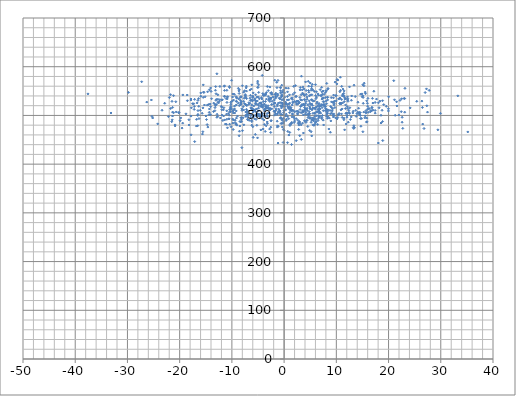
| Category | Series 0 |
|---|---|
| 4.020889663652958 | 487.889 |
| 8.666376458706178 | 494.467 |
| -11.400367761558238 | 539.503 |
| 10.10543404432976 | 564.704 |
| 17.017845351756538 | 510.826 |
| 12.024200785188862 | 496.414 |
| 3.7679746479980896 | 543.188 |
| 13.6166224882079 | 538.771 |
| -7.849052797542254 | 495.155 |
| -16.65649057304688 | 525.623 |
| 4.977959538762961 | 515.277 |
| -14.30051012747557 | 552.571 |
| 26.485316143453833 | 516.425 |
| 9.306132584934135 | 513.712 |
| -9.814722098075785 | 484.224 |
| 2.2791367858373923 | 527.232 |
| -4.667478627555358 | 497.495 |
| 1.972812229281491 | 492.958 |
| 5.702309534434009 | 479.553 |
| -14.06736728329123 | 556.431 |
| 15.539054268911121 | 547.941 |
| 12.882956033211942 | 531.123 |
| -21.469662265395165 | 528.885 |
| 3.291968419121732 | 450.742 |
| -10.209891859033354 | 527.165 |
| -0.6901475152669783 | 519.903 |
| 10.678569320304277 | 548.677 |
| 0.03272742100057964 | 524.516 |
| 8.118310964629085 | 511.563 |
| -0.572068605589451 | 483.486 |
| -11.955807737046143 | 532.019 |
| -4.891582692533757 | 509.408 |
| 3.5328235944934163 | 484.14 |
| 1.1275742094991523 | 481.486 |
| -3.978518819819341 | 528.704 |
| 7.620559774247827 | 520.125 |
| -15.959182661390686 | 546.136 |
| 8.107132174482942 | 550.406 |
| 7.463517362909684 | 550.031 |
| 11.526156246430826 | 528.451 |
| 2.616841155198111 | 529.19 |
| -11.243794592288227 | 482.274 |
| 10.923757760540845 | 523.85 |
| -0.5506642741785494 | 502.108 |
| -11.123671592526163 | 534.777 |
| 22.194955545716013 | 530.988 |
| 5.324095842789516 | 491.753 |
| -6.858480423349419 | 501.786 |
| 19.973253941958355 | 513.623 |
| 3.799321217318141 | 554.472 |
| 5.526508695540478 | 529.255 |
| -25.168814595845866 | 494.727 |
| -9.811035502513509 | 543.996 |
| 7.320830920961375 | 543.422 |
| -4.986446564477005 | 522.674 |
| -1.5756684171854636 | 545.613 |
| -0.8335834247544284 | 505.599 |
| -27.277728749049313 | 569.106 |
| -1.875530647269871 | 531.664 |
| 3.4240633430080365 | 505.965 |
| -7.2689956721881614 | 556.523 |
| -3.387179413627966 | 533.546 |
| 7.240800233243361 | 521.758 |
| -5.021316943802068 | 557.924 |
| -33.150983786689 | 505.009 |
| 10.695639347004956 | 535.718 |
| 9.104212406747815 | 504.783 |
| -18.219286031188865 | 491.137 |
| 11.2673836542509 | 554.069 |
| 20.998615892734758 | 571.234 |
| 22.976995447488626 | 534.796 |
| -6.437276833090726 | 541.323 |
| 6.904272975298067 | 552.968 |
| -12.968195725528197 | 522.207 |
| -8.090534507597123 | 433.855 |
| -3.6248518741455653 | 513.777 |
| 0.1906151296513444 | 518.179 |
| -4.412086276968699 | 518.717 |
| 6.215142262199225 | 537.681 |
| -6.689542375990567 | 489.851 |
| -5.54384850577268 | 500.193 |
| 12.232496162468308 | 529.1 |
| -7.562294072355809 | 550.765 |
| -5.369750026801126 | 491.786 |
| 5.050934207193368 | 542.195 |
| 11.738430657252781 | 514.166 |
| 6.883112295215685 | 497.959 |
| 8.051765675242114 | 529.495 |
| -7.411970291996958 | 522.685 |
| -5.017921443724143 | 557.373 |
| 16.915826145424326 | 534.98 |
| -13.11948904171033 | 520.142 |
| -7.204188643154745 | 549.891 |
| -8.607147365773487 | 545.118 |
| 22.59481806907088 | 486.074 |
| -10.289261413181718 | 515.899 |
| 3.256854055339437 | 480.704 |
| 22.43280632856385 | 507.683 |
| -4.495425267662369 | 525.846 |
| -16.303828797695996 | 493.549 |
| -13.514520739736662 | 507.796 |
| -4.870710572459214 | 547.259 |
| -9.388312029363453 | 485.266 |
| -0.5534771542657639 | 526.042 |
| -7.343947494626702 | 499.085 |
| 3.3980811831222955 | 522.202 |
| 14.840867685781351 | 493.855 |
| -4.533029480275617 | 499.835 |
| -10.51027545952997 | 500.493 |
| -17.30601176615438 | 523.957 |
| -15.250297876450546 | 521.357 |
| 8.412617928507181 | 555.418 |
| 6.908030778679185 | 513.342 |
| 8.862876182075453 | 465.498 |
| 2.265802254576871 | 538.599 |
| -6.535030759373179 | 524.692 |
| 3.6079663396570503 | 558.547 |
| -7.335130754379181 | 507.018 |
| -8.302347213213402 | 537.293 |
| 11.771656671646005 | 521.557 |
| 6.453294856926684 | 512.111 |
| -12.863187392488449 | 585.501 |
| 9.019904037735984 | 536.65 |
| -2.5918385348324855 | 532.995 |
| -0.7821998156380922 | 526.377 |
| -4.079847795319084 | 544.827 |
| 5.540758082312374 | 515.341 |
| -9.054084694791227 | 536.624 |
| 8.865596437877086 | 503.396 |
| -2.771536827236209 | 472.014 |
| 3.4861567451997475 | 552.426 |
| -2.8886126965909704 | 533.641 |
| 6.33122879422555 | 527.652 |
| 7.4011976993006545 | 536.213 |
| -12.671520920202791 | 526.973 |
| 3.008986405605033 | 484.298 |
| 2.9954019070568556 | 458.322 |
| -3.721176898185336 | 508.973 |
| -0.4527448093347102 | 562.011 |
| -4.631427362829501 | 498.902 |
| 9.477008196627233 | 541.793 |
| 12.388533978391964 | 510.437 |
| -0.2642339316140674 | 548.254 |
| -1.7660598708444504 | 507.236 |
| -11.539534516509477 | 515.868 |
| -0.9229786377349976 | 535.562 |
| 15.256986748873247 | 506.833 |
| 10.657074448385298 | 524.319 |
| -1.2944621170838697 | 522.368 |
| -11.828244427921073 | 531.999 |
| 4.562705566871302 | 521.909 |
| 4.831423844168306 | 507.692 |
| 18.75745794546754 | 510.594 |
| -2.2991716892343286 | 529.01 |
| 7.898861567104782 | 536.611 |
| -6.2183763300460155 | 490.014 |
| -8.17876645336175 | 492.156 |
| -7.226172151266567 | 501.332 |
| 2.4601521618704654 | 522.584 |
| 8.94742797030709 | 488.719 |
| -6.1500319676210715 | 513.542 |
| 4.748679404653309 | 498.208 |
| -3.8769093527866954 | 540.759 |
| 11.261910105101496 | 541.552 |
| 6.604071535089689 | 541.622 |
| 15.587928807677107 | 544.629 |
| 3.866141711113143 | 532.723 |
| -0.11612103247951988 | 533.567 |
| -11.035552929769077 | 481.819 |
| 4.730125321286541 | 547.699 |
| -15.495459150222555 | 537.089 |
| 11.212482580054957 | 525.751 |
| 9.719339671237936 | 516.104 |
| 15.681934678567755 | 509.802 |
| -0.12194209419863605 | 531.109 |
| -6.176028438756518 | 531.237 |
| 8.156983124523457 | 505.406 |
| 9.56608912662563 | 524.382 |
| -11.623824665013228 | 511.485 |
| -4.357491706021117 | 536.651 |
| 16.112590596052943 | 514.2 |
| 6.394821238095201 | 506.83 |
| -4.177847068823884 | 582.151 |
| -3.675385649219151 | 497.798 |
| -3.4611014508136915 | 520.535 |
| -9.161469069056281 | 521.493 |
| -17.833178258344365 | 531.713 |
| 1.6662782958403433 | 525.948 |
| 21.14016902829146 | 532.122 |
| 3.601647227532601 | 506.907 |
| -11.407211121839005 | 551.407 |
| 14.9048232541103 | 544.198 |
| 1.26909503791304 | 515.409 |
| -10.432216282862607 | 481.965 |
| -15.639216001202191 | 461.741 |
| 4.998032224693207 | 566.624 |
| 7.891825113254695 | 547.006 |
| 15.46726953179002 | 495.116 |
| 8.36911457673294 | 554.336 |
| -2.7341910452540525 | 528.731 |
| -8.944732433671254 | 498.578 |
| 2.294563684311624 | 539.229 |
| 15.996016611821835 | 518.915 |
| 3.532314995367608 | 545.814 |
| 3.922913444527613 | 516.387 |
| -9.504097154117861 | 513.308 |
| -8.349002199040065 | 537.673 |
| 26.789533576503466 | 473.155 |
| -5.522277980301064 | 530.37 |
| 1.5343684459499374 | 509.961 |
| 6.662172457174716 | 522.363 |
| 5.886855208660111 | 505.198 |
| 4.912371829544569 | 494.15 |
| 15.15191717654285 | 524.908 |
| 5.536488083639955 | 494.92 |
| 9.22585353122807 | 509.318 |
| -2.31018048208808 | 543.458 |
| -8.053843163305988 | 510.396 |
| 9.635246173422262 | 529.359 |
| -3.0807667281212683 | 519.898 |
| -4.014286364591656 | 472.155 |
| -3.767992463028876 | 523.127 |
| -21.747719590051954 | 542.669 |
| -21.170049775620658 | 540.613 |
| -29.792166187702552 | 547.216 |
| 3.677324332029213 | 523.023 |
| -3.2091828828661724 | 483.268 |
| 13.22249328497958 | 508.581 |
| -7.22776952681058 | 560.126 |
| -1.9574790375859892 | 508.729 |
| 1.5410596853289968 | 511.026 |
| -1.2612756237071636 | 540.652 |
| 3.6527147346736846 | 522.155 |
| 11.884493084806618 | 482.468 |
| -5.991312759671497 | 539.595 |
| 6.726843970627275 | 518.429 |
| 3.563253358682552 | 509.785 |
| 14.711855222214117 | 477.864 |
| 6.178728895452695 | 517.147 |
| -12.4164114476203 | 529.127 |
| -8.19884172609439 | 528.036 |
| 5.504764853663712 | 552.071 |
| -13.886531059225694 | 534.305 |
| 3.0525128501819347 | 512.245 |
| 7.190598961647408 | 557.669 |
| 22.7243444899745 | 473.495 |
| 3.1594499847658786 | 518.298 |
| 7.237942664584674 | 548.552 |
| 6.48690610889485 | 489.374 |
| -15.13006567875323 | 538.29 |
| 15.673836223146338 | 505.467 |
| 3.382592669866783 | 531.402 |
| 11.587738651299308 | 470.405 |
| 16.301586772816083 | 514.113 |
| -7.346000797646131 | 537.274 |
| 2.0352927211345153 | 528.726 |
| 3.9859563325237213 | 512.064 |
| 3.0297209828529 | 536.874 |
| 24.13947817652968 | 515.404 |
| -15.547208008286804 | 515.444 |
| 5.322235568195272 | 523.277 |
| 16.773700380185215 | 509.584 |
| -17.832437223969507 | 498.653 |
| 4.405056956435478 | 514.666 |
| 6.628347364245019 | 499.41 |
| -11.416678870618636 | 560.851 |
| -5.072103014475499 | 566.389 |
| -17.138065980567305 | 532.996 |
| -21.177228231403753 | 505.498 |
| 5.525475045700292 | 504.252 |
| 0.4083818048347049 | 502.53 |
| 14.095654946466668 | 506.836 |
| 5.840438744665292 | 480.716 |
| -10.203375108717639 | 523.052 |
| -3.6997910050691725 | 499.298 |
| -9.03368654183378 | 535.173 |
| -18.191868692671193 | 480.351 |
| -0.3473666563452558 | 525.499 |
| -7.172442270153729 | 508.461 |
| -1.3579150360048953 | 501.856 |
| 10.748639041550023 | 523.428 |
| 5.099636988114229 | 522.583 |
| -4.858493562522153 | 520.206 |
| 8.973290730328511 | 510.14 |
| 0.8167764318272951 | 555.976 |
| 13.471051881277681 | 475.267 |
| 6.421232325660244 | 519.26 |
| 12.522250009028054 | 558.628 |
| -10.193129030680819 | 518.613 |
| -6.1839463613157415 | 521.226 |
| -3.974231798029071 | 541.512 |
| 3.1753391555867 | 532.267 |
| -1.5393551295178283 | 513.857 |
| -21.35120943886388 | 506.753 |
| 13.166630707599818 | 505.122 |
| -13.23269877102308 | 516.104 |
| 25.402123454529168 | 529.022 |
| -20.87095749208612 | 478.428 |
| -4.812153641499824 | 499.207 |
| -4.791822234159259 | 502.454 |
| 2.580550172987566 | 503.789 |
| 1.9143216239137022 | 485.464 |
| 7.026491717702048 | 519.537 |
| 11.128366049081729 | 495.95 |
| 2.314359638632393 | 448.209 |
| 11.586899685479548 | 537.302 |
| 10.276425581601266 | 495.857 |
| 14.612124839427448 | 493.654 |
| -2.6545596418085897 | 514.286 |
| -5.443832715676571 | 525.408 |
| 8.587979571039511 | 510.498 |
| -5.8775620843742535 | 512.037 |
| 11.448413821122069 | 491.122 |
| 27.26229719149421 | 554.529 |
| 2.378493205683833 | 523.63 |
| 0.3315036471040014 | 523.267 |
| -9.170183791987512 | 529.085 |
| -25.302903702157533 | 498.113 |
| 17.42345668448073 | 526.702 |
| -11.469082202929743 | 559.762 |
| 4.7222963927221935 | 502.078 |
| 1.7189803676005928 | 528.029 |
| -2.7071687997272753 | 535.584 |
| 7.872484515232859 | 509.921 |
| 5.152355206702785 | 551.708 |
| -13.984603853385396 | 549.378 |
| -6.431083210379031 | 495.855 |
| 18.548890911260823 | 484.401 |
| -8.14521385549659 | 487.771 |
| -20.133117398446394 | 506.243 |
| -1.0693498796865948 | 525.563 |
| -12.295484712744054 | 532.365 |
| 10.43826164102534 | 533.85 |
| -16.49720951621134 | 502.087 |
| 7.625913993255683 | 522.46 |
| 11.894636391448632 | 504.707 |
| 4.9046568461575095 | 469.105 |
| 13.248727716470288 | 475.339 |
| -7.411257688362127 | 539.634 |
| -3.642948246665068 | 543.095 |
| 2.935683636814889 | 487.405 |
| 20.017042304917943 | 538.178 |
| -5.473640717293494 | 524.008 |
| 8.074912735472724 | 510.656 |
| 4.308576103031537 | 490.064 |
| 4.708356439643459 | 560.052 |
| -5.537087298549887 | 511.893 |
| -6.247254457562489 | 514.82 |
| 4.4622116755387875 | 510.246 |
| 8.148755141288174 | 502.744 |
| 15.785788290117637 | 486.239 |
| -2.4168316441225968 | 546.889 |
| -11.437093591698531 | 539.057 |
| -3.3424465233690333 | 517.104 |
| 9.545383892767656 | 521.668 |
| 7.352402043301624 | 499.877 |
| 4.828759756218786 | 502.926 |
| 6.091329473862353 | 491.881 |
| 5.652236538582406 | 488.841 |
| -17.54531920625098 | 524.131 |
| 7.921984602981025 | 518.474 |
| 16.103953777190114 | 506.424 |
| -15.370620142310907 | 546.994 |
| -10.446983937720864 | 557.181 |
| -8.576782168502753 | 552.595 |
| 11.108344059945795 | 513.31 |
| -7.99321063535246 | 560.967 |
| 0.4384817630488301 | 492.043 |
| -3.869971552308785 | 490.575 |
| -9.80841436523312 | 509.044 |
| 7.480140192245939 | 490.351 |
| 6.690693150054637 | 524.633 |
| -15.47609990959345 | 562.66 |
| 10.853801044571282 | 525.421 |
| -3.3071573403470977 | 514.304 |
| -11.743580620452962 | 489.621 |
| 6.42461064676102 | 481.525 |
| -21.427809487672874 | 490.962 |
| -20.180276397107015 | 505.353 |
| 27.01369935408559 | 546.925 |
| -17.22264488707575 | 512.469 |
| 11.443226354413099 | 540.182 |
| -1.118296878246059 | 507.166 |
| -9.709481364484924 | 490.649 |
| 5.111974884831262 | 495.319 |
| -2.3700119832116693 | 543.75 |
| 17.18792638456908 | 549.694 |
| -1.874746132503879 | 518.301 |
| -8.310149120890616 | 486.863 |
| -9.45933317139092 | 504.992 |
| -6.102368486131119 | 512.759 |
| 8.302824142769811 | 537.74 |
| 18.848451008243153 | 487.45 |
| -11.909071769863138 | 500.681 |
| 5.31275960534962 | 542.378 |
| 9.37422676171384 | 526.886 |
| -6.30830994615856 | 531.374 |
| 4.102436837867216 | 524.731 |
| -2.8227626129233943 | 514.147 |
| 0.9702953502779554 | 518.094 |
| 3.2654235568020407 | 542.515 |
| 0.9063730655646528 | 514.288 |
| -4.257010690083628 | 533.818 |
| 8.077360188772497 | 509.377 |
| -17.203587692213745 | 518.35 |
| -8.324306867336476 | 525.812 |
| 2.7210639509115446 | 524.375 |
| 9.956437366911324 | 541.096 |
| -17.82020618787468 | 460.157 |
| -18.797713823003583 | 503.249 |
| -18.512644806266064 | 530.182 |
| 4.105319570099351 | 568.784 |
| 26.541010633620537 | 482.245 |
| 3.783884532118521 | 521.752 |
| -0.13604454473010485 | 493.897 |
| 29.44929156340108 | 470.439 |
| -9.846774537727434 | 492.514 |
| 0.2480072175359735 | 527.474 |
| -5.761758748034638 | 511.025 |
| 4.537034491521446 | 477.394 |
| 4.242452236158169 | 543.375 |
| 11.030530244709055 | 559.659 |
| -9.223574017437212 | 538.514 |
| -0.10486147346082603 | 505.931 |
| -10.48336773062374 | 559.571 |
| -1.2752808803190203 | 478.603 |
| -21.725982194978343 | 514.213 |
| -5.918152474961466 | 454.93 |
| -3.050247468917641 | 538.698 |
| 8.292434834967478 | 511.539 |
| 0.2944107458686491 | 512.234 |
| 5.269362457527384 | 531.969 |
| -1.4091774831485862 | 568.088 |
| -5.953433308258757 | 506.922 |
| 0.10599963726106948 | 537.509 |
| -14.340685886636946 | 506.372 |
| -0.3650521946907063 | 490.15 |
| -2.879377150570108 | 533.601 |
| -11.941732311762005 | 511.594 |
| -6.188929351264185 | 487.323 |
| 6.934080717091058 | 519.364 |
| -5.666189919465707 | 493.167 |
| -6.186077774851922 | 479.997 |
| 1.585401060849973 | 503.506 |
| -9.73364536120543 | 505.067 |
| 5.180977163226031 | 466.542 |
| 1.346745252966687 | 509.562 |
| 0.8905686501307758 | 523.353 |
| -8.613902428699015 | 458.231 |
| -16.361280891747988 | 534.655 |
| -12.290319776365347 | 559.518 |
| -21.367036366437052 | 498.755 |
| 12.858603070205112 | 496.901 |
| 3.958108118163621 | 520.671 |
| -11.033496832100855 | 502.523 |
| 0.6121140786095336 | 522.024 |
| 9.453250935023348 | 527.423 |
| -17.83417819554732 | 533.714 |
| 1.2930807926330354 | 516.197 |
| -4.750338519460241 | 534.153 |
| -9.127579874779894 | 494.582 |
| -1.6215894340838208 | 539.059 |
| -2.495642938280925 | 489.453 |
| 1.6246878742357154 | 502.24 |
| 3.054579876867479 | 552.403 |
| -14.647149624870762 | 548.486 |
| -9.687096849320218 | 531.6 |
| 16.05010855852264 | 535.067 |
| -0.3382400303715375 | 518.667 |
| -4.256679425265922 | 503.98 |
| -20.655949982774928 | 507.159 |
| -8.259674211107786 | 538.678 |
| -1.7689973076697663 | 572.184 |
| -7.151391854199364 | 520.195 |
| -0.6362210882771837 | 495.084 |
| -2.728370801442637 | 558.232 |
| -6.963113604947952 | 491.185 |
| 7.250061105238178 | 533.609 |
| -8.476400511836422 | 478.275 |
| 33.26945893613906 | 540.175 |
| -6.533739300597593 | 535.348 |
| -14.072095924104183 | 518.023 |
| -4.710442376874059 | 525.039 |
| 6.784343958041836 | 508.191 |
| 15.556431174684667 | 499.084 |
| -0.6234696943460811 | 495.546 |
| 5.953714219481546 | 513.311 |
| -1.2238555189393547 | 503.906 |
| -0.6967672838892256 | 550.805 |
| -6.32214343975231 | 515.962 |
| 17.69340396142605 | 533.567 |
| -6.019222268800444 | 536.885 |
| -7.755245486815628 | 547.803 |
| -14.149539102620635 | 523.451 |
| 0.6581072493272837 | 548.435 |
| -1.323339076512532 | 488.178 |
| -0.22138708228966553 | 518.841 |
| -7.05473676750502 | 505.228 |
| -14.507622103194544 | 522.271 |
| -4.889188498898087 | 562.769 |
| 5.251805670783067 | 559.591 |
| 9.33450010872184 | 501.399 |
| 4.627412064042677 | 570.01 |
| -1.128867525908814 | 477.867 |
| 0.43126924554415647 | 524.744 |
| -24.203067260715265 | 482.679 |
| 5.767467292624465 | 493.297 |
| -20.742374668966438 | 528.124 |
| -0.7603687112696139 | 508.98 |
| 3.7017013214887937 | 463.931 |
| 5.337241691348099 | 490.137 |
| -22.867918141000747 | 525.024 |
| -6.102516412615222 | 530.569 |
| -14.29478780713743 | 513.197 |
| -16.056998856897952 | 510.502 |
| -15.693352862221044 | 504.393 |
| -0.44172527040828713 | 532.324 |
| 8.244135492924357 | 493.992 |
| 18.551838678884476 | 500.281 |
| -5.95818184099786 | 497.31 |
| -1.8475692372826624 | 500.539 |
| 26.385062482495186 | 529.414 |
| 6.658096238182488 | 496.629 |
| -9.050965031461548 | 480.044 |
| 0.27887282062855706 | 498.603 |
| 3.900410666202293 | 540.668 |
| -19.909432457542 | 489.165 |
| 1.724223087621332 | 510.208 |
| 8.382781024144 | 497.153 |
| 12.219360840930726 | 534.081 |
| -9.167520041561497 | 509.162 |
| -5.5141922567837796 | 461.048 |
| -0.37755112032424215 | 539.912 |
| -5.995304761575391 | 476.765 |
| 8.301769905127202 | 536.688 |
| 18.067668429475848 | 525.95 |
| -4.144436690352646 | 503.843 |
| -0.16013144081507652 | 552.021 |
| 9.771693574605035 | 568.427 |
| 8.916877078221122 | 518.278 |
| 15.843960997354436 | 494.48 |
| -7.061694382826353 | 501.708 |
| 21.97560301685554 | 500.794 |
| 7.930149818531027 | 514.398 |
| -0.6439440365568285 | 501.732 |
| -5.226381877920472 | 498.162 |
| -0.4568351160825379 | 540.767 |
| -14.70597654826075 | 521.074 |
| 5.744592656690811 | 530.025 |
| 1.0638546872784183 | 525.242 |
| -6.739550272089537 | 526.051 |
| -19.535353101396655 | 474.01 |
| -6.958263498586246 | 497.275 |
| 4.06472470363797 | 502.553 |
| 16.998945938680254 | 525.469 |
| 12.938311229731067 | 539.956 |
| 12.121919026388293 | 504.913 |
| 0.004800069609173341 | 469.613 |
| -0.4241542228069659 | 483.69 |
| 2.597163799700031 | 509.026 |
| 12.286337654557386 | 486.188 |
| -4.450807528215792 | 470.275 |
| 3.2305947378871824 | 505.965 |
| -4.362897485309376 | 525.656 |
| -19.785478239282426 | 494.831 |
| -37.55972409161709 | 544.215 |
| -3.505866680531643 | 543.919 |
| -0.9132150245891215 | 510.004 |
| 1.5512577002615004 | 521.461 |
| -5.364488843984183 | 529.433 |
| -12.675672551469958 | 533.153 |
| -9.750229077663846 | 471.162 |
| 4.210399053883628 | 512.843 |
| -7.181783748695251 | 534.539 |
| -0.7120426363876254 | 557.286 |
| 5.933282866475037 | 515.212 |
| 2.6996676815089016 | 529.63 |
| 2.857640925887741 | 525.809 |
| 16.60936621589288 | 510.134 |
| -12.982190085619507 | 532.878 |
| -1.1624233999332252 | 443.275 |
| 7.6551994548488205 | 543.297 |
| 23.08843999014409 | 534.673 |
| 10.57193332029111 | 534.636 |
| 0.6377734350643915 | 538.769 |
| -4.9345665537033145 | 537.85 |
| -2.0450595858920475 | 523.09 |
| 11.645051500183001 | 533.906 |
| 11.50018026948345 | 550.28 |
| -0.2257748577250684 | 501.25 |
| -1.635815230352878 | 503.651 |
| 5.28952823767392 | 458.007 |
| 16.81672300521372 | 516.722 |
| -10.572617077197902 | 493.068 |
| -16.486783908972644 | 509.874 |
| 4.365579097497372 | 537.574 |
| 5.391178088431222 | 513.032 |
| 6.46349759474927 | 544.266 |
| -7.305866586454585 | 497.719 |
| 23.09194013601152 | 506.637 |
| 14.595222336673002 | 499.822 |
| 6.26202920458108 | 524.452 |
| 7.188621760799809 | 493.524 |
| -3.8640586802706327 | 542.536 |
| 0.6555871712550072 | 444.092 |
| -8.239919831276378 | 523.38 |
| -8.550821782461545 | 467.564 |
| -2.509094621439723 | 535.769 |
| 3.689065949357093 | 501.081 |
| -13.249187568366096 | 523.085 |
| -10.943547865078546 | 526.701 |
| -3.2780509571643925 | 503.54 |
| -6.185619720122894 | 562.74 |
| 21.268474917020587 | 500.232 |
| 13.941362738276103 | 503.641 |
| -7.658350992747432 | 535.217 |
| 12.68694826148194 | 491.67 |
| -8.585402989710554 | 520.26 |
| -7.20379012325545 | 521.454 |
| 0.34465114281333403 | 556.076 |
| -3.6299015244619977 | 541.394 |
| 1.0294235481886476 | 542.292 |
| 2.9353858806421442 | 526.811 |
| -5.132537653609493 | 529.622 |
| -2.5872998291479474 | 546.198 |
| 13.390384520121929 | 562.076 |
| -3.432971211351353 | 478.694 |
| -5.135184993531106 | 503.49 |
| 6.5458169633437695 | 493.563 |
| 7.21215211442144 | 522.276 |
| -1.693252300459516 | 543.255 |
| -1.7081873624657113 | 543.004 |
| 7.102815387307553 | 540.732 |
| -0.6792147308382637 | 546.242 |
| 27.329900228706183 | 519.784 |
| -5.464377560884144 | 542.492 |
| -5.384918027468398 | 522.499 |
| -10.844661930289313 | 537.859 |
| -2.947150313077692 | 531.262 |
| 0.7069910969582791 | 467.244 |
| -1.7523447273800588 | 508.841 |
| -4.888051344050183 | 515.048 |
| 4.369642222724033 | 489.734 |
| -6.314900690023464 | 501.316 |
| -12.839667391647254 | 502.315 |
| 1.0771539817097415 | 465.071 |
| -0.3363170521553991 | 476.306 |
| 5.900367596959528 | 497.834 |
| -1.033790021337402 | 512.873 |
| 12.171073811954347 | 531.558 |
| -9.380646010768269 | 490.191 |
| 8.130484871564391 | 511.956 |
| 18.847552080176413 | 530.204 |
| -13.051431102662988 | 530.989 |
| 4.870020165405833 | 517.72 |
| 1.5136328065634472 | 497.088 |
| 15.080994141281362 | 540.194 |
| -3.618186565444027 | 467.166 |
| 22.603442664999008 | 496.225 |
| -13.25955528439246 | 509.732 |
| 8.166214474774332 | 565.71 |
| -7.836376757677323 | 518.108 |
| 10.52686010212723 | 503.964 |
| -5.089328319786722 | 453.909 |
| 12.411770439699959 | 506.276 |
| 10.788051766639615 | 551.317 |
| -1.57535485198935 | 510.911 |
| -4.120937756037683 | 516.566 |
| 29.94296933724462 | 504.291 |
| -12.193944135419574 | 494.771 |
| 15.290430267596486 | 560.952 |
| -3.217051809981814 | 559.379 |
| 2.7740358221653136 | 485.003 |
| -6.041583374825814 | 530.06 |
| 6.681484045969806 | 508.969 |
| 7.503328201279311 | 509.751 |
| 9.073922749954752 | 527.832 |
| -8.2225744413526 | 495.339 |
| -6.233091184288786 | 513.492 |
| 10.157568507268117 | 573.594 |
| 5.889840110099728 | 503.811 |
| 6.272796509130416 | 499.53 |
| 18.888613708302994 | 448.419 |
| -18.548649290481624 | 541.93 |
| -4.971630746224707 | 502.612 |
| 11.010880923193454 | 532.732 |
| 4.94439992058296 | 524.953 |
| 4.825706908177607 | 529.858 |
| 9.447122083899231 | 536.157 |
| -10.390874198556629 | 512.079 |
| 2.306188476750012 | 508.296 |
| -26.30380595809507 | 527.393 |
| 9.542496527224587 | 499.582 |
| 5.275005619746241 | 532.242 |
| 21.60480827491838 | 519.466 |
| -12.031733499923662 | 518.756 |
| -14.737618097939533 | 481.151 |
| -0.2700963939154595 | 522.453 |
| 17.422481884872823 | 510.188 |
| -2.5651659907293336 | 465.043 |
| 27.775081735465832 | 551.493 |
| 9.9103358958794 | 540.332 |
| -8.654204820528124 | 550.308 |
| -6.989225439638106 | 492.306 |
| 2.7872007980758218 | 471.306 |
| -9.511766962098765 | 543.378 |
| 3.983166231437439 | 510.269 |
| -1.3747727924348068 | 556.995 |
| -10.086082207095687 | 512.959 |
| 11.853660425473542 | 504.07 |
| 8.138911165545196 | 524.118 |
| 10.776638146431864 | 525.456 |
| 1.9857656203354035 | 507.458 |
| 11.160664603930613 | 540.035 |
| 1.2484869584092837 | 510.812 |
| -10.34492822706847 | 512.283 |
| 1.8589042241412492 | 496.783 |
| -0.1417390963934519 | 471.541 |
| 4.178437444992797 | 506.594 |
| 6.7279056696941275 | 504.799 |
| -7.75195901486442 | 511.276 |
| -16.339060387428145 | 518.757 |
| -4.202359961861752 | 493.433 |
| -13.477562553108902 | 525.288 |
| 6.641002379705734 | 512.277 |
| -3.2112595641615145 | 497.941 |
| -5.64458687500238 | 532.992 |
| -3.7940326896255314 | 481.352 |
| 15.129157515082955 | 536.958 |
| -5.507154622292681 | 508.084 |
| 6.178237406451144 | 548.814 |
| 15.090243086504389 | 466.506 |
| 12.091611485632312 | 500.241 |
| -10.89231296438762 | 533.837 |
| -17.12856143061399 | 446.287 |
| -25.414251067161644 | 531.727 |
| 19.074850020775195 | 522.105 |
| -8.761196088248035 | 555.703 |
| 7.039165719630655 | 540.803 |
| 1.4202399188618369 | 440.349 |
| 8.56768161964107 | 472.149 |
| -7.74161981882633 | 528.915 |
| 6.008315630900417 | 563.111 |
| -3.8068740914853776 | 511.503 |
| 12.211365795729325 | 514.15 |
| 18.184305208693353 | 515.74 |
| 0.8766995765761157 | 493.411 |
| 9.86190403428011 | 494.966 |
| 3.3734050667559825 | 519.902 |
| 1.7052444050285285 | 543.391 |
| 10.137003923681197 | 492.918 |
| 11.81821886220734 | 534.203 |
| 3.1025036111492588 | 557.309 |
| -10.06107424612437 | 572.116 |
| -3.5703170120076813 | 517.981 |
| 6.102282185069223 | 534.47 |
| -0.2057435062554679 | 483.976 |
| -9.209385801244915 | 482.847 |
| 7.2285754048055875 | 495.686 |
| 1.0611825563957595 | 505.836 |
| 7.571196130655228 | 480.429 |
| 4.217292548623022 | 551.128 |
| 4.181123010045611 | 485.697 |
| -5.192541287772125 | 537.683 |
| 10.890000346084872 | 511.351 |
| -4.220931150172537 | 499.314 |
| 10.404364369302979 | 501.538 |
| 2.185171249931062 | 561.216 |
| 0.679368972370732 | 497.706 |
| 13.80845362207067 | 498.062 |
| -10.17496677768883 | 514.52 |
| 7.817371724589159 | 518.023 |
| 15.851168406216978 | 487.155 |
| -2.7362905877282437 | 511.047 |
| -6.4613964867348015 | 530.691 |
| -16.50285836932832 | 530.922 |
| 3.659474473455089 | 543.983 |
| -5.919040618310689 | 546.189 |
| -6.767674108632309 | 522.795 |
| 14.16799324105211 | 504.322 |
| 1.5767685972805923 | 533.035 |
| -7.205595194879914 | 512.51 |
| 10.384480528904689 | 501.293 |
| -21.5172882123669 | 487.062 |
| 1.3359438902056537 | 483.163 |
| 9.103611163582105 | 516.307 |
| 7.483617023475434 | 528.3 |
| 0.8849691481634056 | 532.044 |
| 15.077609886787291 | 562.92 |
| 4.838790677734731 | 540.074 |
| -2.9910217492587434 | 513.923 |
| 16.8342855197346 | 515.617 |
| -0.7836355728984332 | 533.815 |
| 8.323598652455392 | 531.826 |
| -10.537941841074108 | 492.833 |
| -19.39364789747292 | 542.082 |
| 1.378367029696404 | 483.656 |
| 4.754802285511402 | 503.78 |
| -6.114355388835901 | 513.021 |
| 12.139829186332475 | 538.194 |
| 15.336764553798565 | 566.264 |
| -14.36474926185186 | 501.403 |
| -8.451608162969922 | 487.586 |
| -7.975992593175293 | 468.676 |
| -12.558108232626566 | 525.596 |
| -12.684586112888374 | 542.254 |
| -2.99425184865799 | 505.194 |
| 19.569988268857905 | 518.726 |
| -10.984902356173189 | 509.391 |
| 19.975280622277168 | 509.195 |
| -23.378332605700272 | 510.636 |
| -9.933649037805397 | 529.474 |
| -4.099708047302974 | 518.944 |
| -3.398795645473862 | 546.866 |
| 8.307092393863536 | 507.44 |
| -8.66184758826701 | 533.921 |
| -7.71156513733818 | 480.637 |
| -0.38501436981006715 | 547.279 |
| -9.204664123903576 | 481.875 |
| 2.8001558799334494 | 506.736 |
| -1.2940285563900824 | 519.283 |
| -1.8621289499823153 | 526.126 |
| -1.1811257837595859 | 571.881 |
| -3.583694250894096 | 528.655 |
| -7.431112956174776 | 540.706 |
| -15.421890733206387 | 548.066 |
| 4.398510662063383 | 502.037 |
| 12.57575111261715 | 515.782 |
| 11.216057194524113 | 543.625 |
| 1.3743362542094593 | 535.323 |
| -10.964386589642315 | 551.59 |
| 6.104373129026558 | 487.264 |
| -8.312096876440288 | 521.944 |
| 3.9177097552985205 | 489.345 |
| 13.371641487108839 | 478.906 |
| 3.940449887540899 | 532.245 |
| 3.745050019684434 | 508.158 |
| 0.9107983984921924 | 459.676 |
| -14.859300651656886 | 491.581 |
| 6.243016230232318 | 507.658 |
| -16.542504165698816 | 499.926 |
| 0.2540744738786766 | 510.876 |
| -3.9725902804407673 | 521.796 |
| -2.3626945471715293 | 513.558 |
| 7.693720973838522 | 521.712 |
| 2.713405017679002 | 483.241 |
| -16.75871879804329 | 491.94 |
| -5.0650498512862105 | 570.377 |
| 1.1700887817271655 | 511.835 |
| -10.236441820227977 | 507.616 |
| 4.415929979355676 | 533.355 |
| -1.2903474897524276 | 476.038 |
| -13.105981379508375 | 559.15 |
| -16.54016366726476 | 478.836 |
| -1.672107421700956 | 535.387 |
| -13.144350902162024 | 551.631 |
| 15.980875716950319 | 512.602 |
| 13.711013033622308 | 510.417 |
| 6.033830196933522 | 515.83 |
| -0.3811935803974405 | 492.427 |
| -0.709347735592938 | 493.952 |
| 0.7141511046116931 | 517.428 |
| -9.564114479291304 | 511.603 |
| -0.36614611503981404 | 519.092 |
| -17.758522667065517 | 515.544 |
| 14.457073810201406 | 502.346 |
| -3.3822570801842846 | 515.25 |
| -7.631052781499907 | 524.472 |
| 5.333930893514215 | 511.504 |
| -5.571438777067369 | 534.475 |
| 0.07498803898690676 | 546.106 |
| -8.338592021059366 | 530.851 |
| 27.458337296167063 | 506.805 |
| -5.237503506929283 | 513.334 |
| -6.551141218748987 | 552.077 |
| -8.77228844237277 | 525.194 |
| 2.018730695039313 | 488.498 |
| 2.308589308512405 | 493.472 |
| 6.702229232687957 | 514.662 |
| -0.06269288625103764 | 509.535 |
| -6.0065181217651995 | 537.905 |
| 2.0252962554425467 | 546.635 |
| -0.5117578896310551 | 515.347 |
| -21.974454667136925 | 536.705 |
| -2.394664500550101 | 522.456 |
| -11.928302731957798 | 516.951 |
| -16.797487285292362 | 478.206 |
| 35.17445199949198 | 466.139 |
| 5.175577857513583 | 485.917 |
| 13.335656086833438 | 473.171 |
| -0.16912139084960054 | 444.474 |
| 1.1274034756879574 | 479.318 |
| 14.261408227910119 | 514.77 |
| 8.309590741027609 | 504.164 |
| 8.140389231343198 | 498.223 |
| -14.973145160772123 | 498.924 |
| 12.519630592063109 | 504.181 |
| 17.441440594963698 | 504.749 |
| -10.421422722946845 | 507.409 |
| 3.318655591647529 | 580.528 |
| 18.343263581507376 | 529.393 |
| 14.634184223079783 | 543.66 |
| -0.06284740214557122 | 487.055 |
| 10.990015301493669 | 503.162 |
| 0.8998539211296315 | 514.882 |
| 7.628950905441333 | 528.086 |
| -10.162109572631163 | 476.735 |
| 12.094492882093562 | 517.919 |
| -11.58821075326398 | 498.995 |
| -11.379841584965593 | 490.852 |
| 4.8391396032542096 | 504.03 |
| -2.141271126183701 | 537.522 |
| 11.467086074776303 | 494.443 |
| -0.43162479537789644 | 542.409 |
| -8.19582311523147 | 495.492 |
| -19.42592868282152 | 484.177 |
| 6.996328564244846 | 504.73 |
| -7.442935747766544 | 542.806 |
| 2.8371510740615826 | 480.218 |
| -1.2128009511248863 | 543.664 |
| -10.849666122570698 | 474.568 |
| -6.992547568842583 | 508.153 |
| -3.038344903316733 | 550.974 |
| -3.229480744137382 | 486.524 |
| 2.645488142479159 | 490.029 |
| 9.99062264409887 | 529.768 |
| -3.730684756031459 | 513.002 |
| 15.713497456232735 | 505.947 |
| -9.496060501093101 | 518.934 |
| -7.315950778328602 | 522.017 |
| -8.101648420127797 | 513.461 |
| 4.596731366207258 | 495.47 |
| 10.767766705157845 | 578.42 |
| 1.8347433447142676 | 559.696 |
| 5.528312311633229 | 491.092 |
| -5.220868024128489 | 479.741 |
| 1.5795615689218452 | 535.971 |
| 2.460616812644074 | 529.638 |
| 14.952659624677437 | 538.364 |
| 15.818536791929779 | 530.002 |
| -1.7621033776389423 | 525.273 |
| 11.41876790859872 | 545.249 |
| 21.541197031267785 | 527.91 |
| -15.948790087397377 | 539.475 |
| -21.35937730572458 | 516.506 |
| -22.14970684544093 | 497.565 |
| 14.140619701561306 | 527.149 |
| -4.3432839174282565 | 522.176 |
| -10.96365265674091 | 491.995 |
| -13.030397630386446 | 544.47 |
| 6.0382819891373245 | 486.392 |
| -0.5489915205562309 | 537.774 |
| -14.088781649359637 | 501.677 |
| 7.505376222288493 | 535.281 |
| -6.264177790448194 | 554.169 |
| -20.878671805604444 | 480.53 |
| 9.495164476586899 | 503.173 |
| 4.201973994153061 | 528.678 |
| -15.561119257331193 | 466.507 |
| 8.001699286088176 | 550.904 |
| 5.529454240041086 | 480.71 |
| -10.694730338211805 | 503.973 |
| 22.502296526755803 | 534.218 |
| 1.468052377566749 | 485.699 |
| 7.281841852494549 | 516.15 |
| 1.3694583255488497 | 511.936 |
| 4.665443839864178 | 551.186 |
| -14.603069500824645 | 476.057 |
| 0.6000826303763285 | 531.789 |
| 5.787803432275902 | 549.217 |
| 0.39666790518635464 | 489.606 |
| 9.422515254298084 | 496.849 |
| -10.833717707095998 | 538.412 |
| -9.080112509379795 | 528.779 |
| 5.269494139003791 | 555.53 |
| 16.513613793313723 | 507.478 |
| -5.810626559875654 | 519.448 |
| -0.6667483768008182 | 556.572 |
| -2.4965073782905853 | 488.842 |
| 5.434293966036418 | 520.644 |
| 6.03870484511093 | 541.063 |
| -12.866962606947142 | 496.183 |
| 14.591968328477726 | 505.646 |
| 2.585181056990604 | 502.643 |
| -2.547154522710991 | 475.858 |
| 18.04491240205724 | 443.391 |
| -3.0615621959995654 | 515.563 |
| 5.382310168574342 | 563.792 |
| 5.970821430078701 | 484.421 |
| 4.005324005385206 | 513.166 |
| 7.632229419600435 | 522.319 |
| -12.735919175209853 | 498.137 |
| -9.86166362855544 | 537.873 |
| 5.005535172894333 | 513.278 |
| -1.5463098527087682 | 537.21 |
| 10.279433241391 | 572.504 |
| -4.435871450237496 | 518.558 |
| 15.956062876943696 | 524.96 |
| 23.141815061331883 | 555.67 |
| 14.408651880532735 | 506.296 |